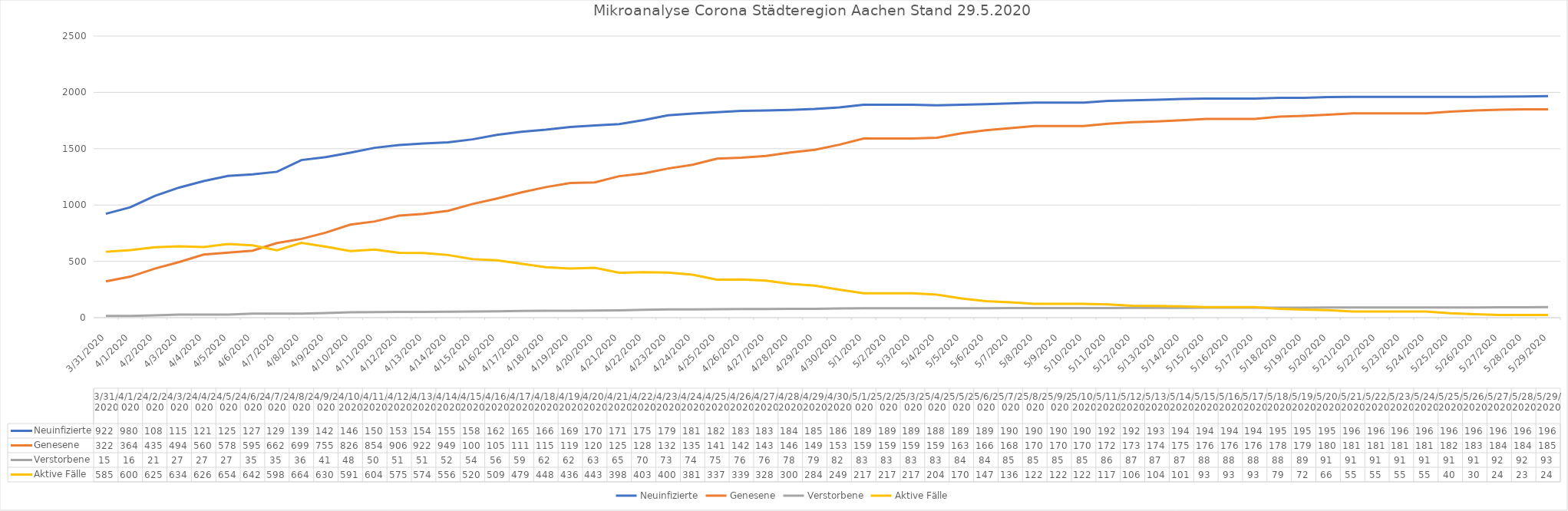
| Category | Neuinfizierte | Genesene | Verstorbene | Aktive Fälle |
|---|---|---|---|---|
| 3/31/20 | 922 | 322 | 15 | 585 |
| 4/1/20 | 980 | 364 | 16 | 600 |
| 4/2/20 | 1081 | 435 | 21 | 625 |
| 4/3/20 | 1155 | 494 | 27 | 634 |
| 4/4/20 | 1213 | 560 | 27 | 626 |
| 4/5/20 | 1259 | 578 | 27 | 654 |
| 4/6/20 | 1272 | 595 | 35 | 642 |
| 4/7/20 | 1295 | 662 | 35 | 598 |
| 4/8/20 | 1399 | 699 | 36 | 664 |
| 4/9/20 | 1426 | 755 | 41 | 630 |
| 4/10/20 | 1465 | 826 | 48 | 591 |
| 4/11/20 | 1508 | 854 | 50 | 604 |
| 4/12/20 | 1532 | 906 | 51 | 575 |
| 4/13/20 | 1547 | 922 | 51 | 574 |
| 4/14/20 | 1557 | 949 | 52 | 556 |
| 4/15/20 | 1583 | 1009 | 54 | 520 |
| 4/16/20 | 1623 | 1058 | 56 | 509 |
| 4/17/20 | 1650 | 1112 | 59 | 479 |
| 4/18/20 | 1669 | 1159 | 62 | 448 |
| 4/19/20 | 1693 | 1195 | 62 | 436 |
| 4/20/20 | 1707 | 1201 | 63 | 443 |
| 4/21/20 | 1719 | 1256 | 65 | 398 |
| 4/22/20 | 1754 | 1281 | 70 | 403 |
| 4/23/20 | 1797 | 1324 | 73 | 400 |
| 4/24/20 | 1812 | 1357 | 74 | 381 |
| 4/25/20 | 1824 | 1412 | 75 | 337 |
| 4/26/20 | 1835 | 1420 | 76 | 339 |
| 4/27/20 | 1839 | 1435 | 76 | 328 |
| 4/28/20 | 1845 | 1467 | 78 | 300 |
| 4/29/20 | 1853 | 1490 | 79 | 284 |
| 4/30/20 | 1866 | 1535 | 82 | 249 |
| 5/1/20 | 1891 | 1591 | 83 | 217 |
| 5/2/20 | 1891 | 1591 | 83 | 217 |
| 5/3/20 | 1891 | 1591 | 83 | 217 |
| 5/4/20 | 1885 | 1598 | 83 | 204 |
| 5/5/20 | 1890 | 1636 | 84 | 170 |
| 5/6/20 | 1895 | 1664 | 84 | 147 |
| 5/7/20 | 1903 | 1682 | 85 | 136 |
| 5/8/20 | 1909 | 1702 | 85 | 122 |
| 5/9/20 | 1909 | 1702 | 85 | 122 |
| 5/10/20 | 1909 | 1702 | 85 | 122 |
| 5/11/20 | 1924 | 1721 | 86 | 117 |
| 5/12/20 | 1929 | 1736 | 87 | 106 |
| 5/13/20 | 1934 | 1743 | 87 | 104 |
| 5/14/20 | 1941 | 1753 | 87 | 101 |
| 5/15/20 | 1945 | 1764 | 88 | 93 |
| 5/16/20 | 1945 | 1764 | 88 | 93 |
| 5/17/20 | 1945 | 1764 | 88 | 93 |
| 5/18/20 | 1951 | 1784 | 88 | 79 |
| 5/19/20 | 1952 | 1791 | 89 | 72 |
| 5/20/20 | 1958 | 1801 | 91 | 66 |
| 5/21/20 | 1960 | 1814 | 91 | 55 |
| 5/22/20 | 1960 | 1814 | 91 | 55 |
| 5/23/20 | 1960 | 1814 | 91 | 55 |
| 5/24/20 | 1960 | 1814 | 91 | 55 |
| 5/25/20 | 1960 | 1829 | 91 | 40 |
| 5/26/20 | 1960 | 1839 | 91 | 30 |
| 5/27/20 | 1962 | 1846 | 92 | 24 |
| 5/28/20 | 1964 | 1849 | 92 | 23 |
| 5/29/20 | 1967 | 1850 | 93 | 24 |